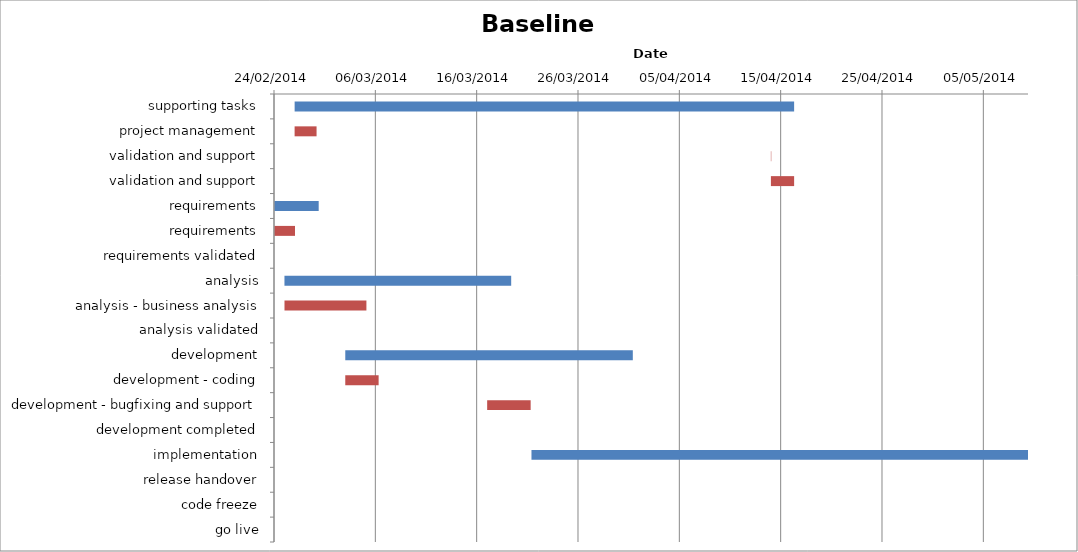
| Category | Baseline start | Actual duration |
|---|---|---|
| supporting tasks | 41696.333 | 49.292 |
| project management | 41696.333 | 2.167 |
| validation and support | 41743.333 | 0.042 |
| validation and support | 41743.333 | 2.292 |
| requirements | 41694.333 | 4.375 |
| requirements | 41694.333 | 2.042 |
| requirements validated | 41698.708 | 0 |
| analysis | 41695.333 | 22.375 |
| analysis - business analysis | 41695.333 | 8.083 |
| analysis validated | 41717.708 | 0 |
| development | 41701.333 | 28.375 |
| development - coding | 41701.333 | 3.292 |
| development - bugfixing and support | 41715.333 | 4.292 |
| development completed | 41729.708 | 0 |
| implementation | 41719.708 | 49 |
| release handover | 41719.708 | 0 |
| code freeze | 41754.708 | 0 |
| go live | 41768.708 | 0 |